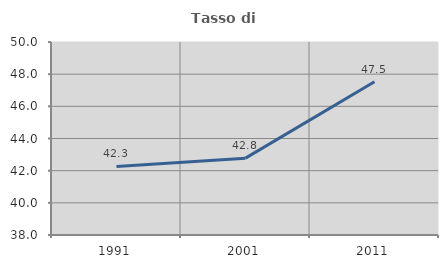
| Category | Tasso di occupazione   |
|---|---|
| 1991.0 | 42.261 |
| 2001.0 | 42.78 |
| 2011.0 | 47.533 |